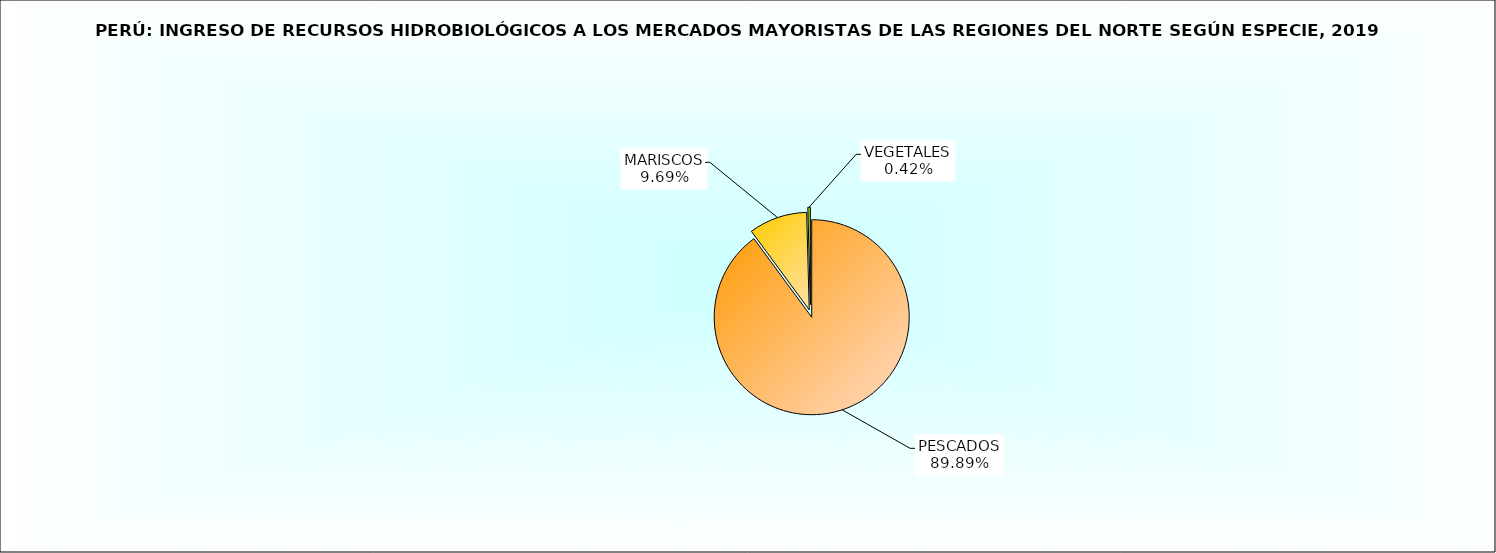
| Category | Series 0 |
|---|---|
| PESCADOS | 0.899 |
| MARISCOS | 0.097 |
| VEGETALES | 0.004 |